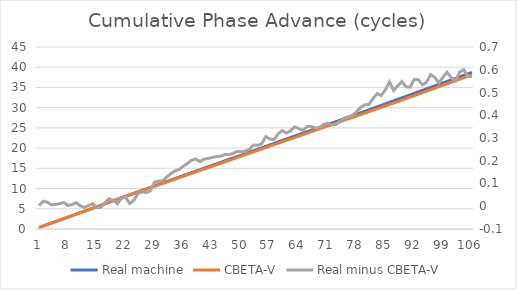
| Category | Real machine | CBETA-V |
|---|---|---|
| 0 | 0.363 | 0.36 |
| 1 | 0.741 | 0.719 |
| 2 | 1.109 | 1.09 |
| 3 | 1.47 | 1.464 |
| 4 | 1.836 | 1.828 |
| 5 | 2.202 | 2.191 |
| 6 | 2.577 | 2.561 |
| 7 | 2.937 | 2.933 |
| 8 | 3.303 | 3.296 |
| 9 | 3.673 | 3.657 |
| 10 | 4.034 | 4.032 |
| 11 | 4.397 | 4.402 |
| 12 | 4.766 | 4.763 |
| 13 | 5.142 | 5.13 |
| 14 | 5.498 | 5.504 |
| 15 | 5.867 | 5.872 |
| 16 | 6.249 | 6.232 |
| 17 | 6.631 | 6.598 |
| 18 | 6.997 | 6.97 |
| 19 | 7.346 | 7.335 |
| 20 | 7.725 | 7.69 |
| 21 | 8.096 | 8.057 |
| 22 | 8.437 | 8.426 |
| 23 | 8.807 | 8.781 |
| 24 | 9.19 | 9.134 |
| 25 | 9.56 | 9.497 |
| 26 | 9.917 | 9.857 |
| 27 | 10.27 | 10.203 |
| 28 | 10.662 | 10.556 |
| 29 | 11.028 | 10.918 |
| 30 | 11.377 | 11.266 |
| 31 | 11.74 | 11.611 |
| 32 | 12.117 | 11.974 |
| 33 | 12.484 | 12.328 |
| 34 | 12.832 | 12.671 |
| 35 | 13.206 | 13.03 |
| 36 | 13.581 | 13.392 |
| 37 | 13.94 | 13.739 |
| 38 | 14.298 | 14.09 |
| 39 | 14.652 | 14.456 |
| 40 | 15.016 | 14.81 |
| 41 | 15.366 | 15.156 |
| 42 | 15.731 | 15.517 |
| 43 | 16.096 | 15.879 |
| 44 | 16.445 | 16.225 |
| 45 | 16.805 | 16.578 |
| 46 | 17.171 | 16.944 |
| 47 | 17.528 | 17.296 |
| 48 | 17.884 | 17.643 |
| 49 | 18.246 | 18.005 |
| 50 | 18.608 | 18.366 |
| 51 | 18.961 | 18.711 |
| 52 | 19.336 | 19.066 |
| 53 | 19.699 | 19.432 |
| 54 | 20.057 | 19.782 |
| 55 | 20.436 | 20.13 |
| 56 | 20.79 | 20.494 |
| 57 | 21.146 | 20.853 |
| 58 | 21.516 | 21.198 |
| 59 | 21.887 | 21.555 |
| 60 | 22.241 | 21.919 |
| 61 | 22.6 | 22.269 |
| 62 | 22.967 | 22.617 |
| 63 | 23.323 | 22.982 |
| 64 | 23.673 | 23.339 |
| 65 | 24.034 | 23.684 |
| 66 | 24.393 | 24.043 |
| 67 | 24.752 | 24.407 |
| 68 | 25.099 | 24.754 |
| 69 | 25.465 | 25.105 |
| 70 | 25.835 | 25.47 |
| 71 | 26.18 | 25.822 |
| 72 | 26.526 | 26.167 |
| 73 | 26.903 | 26.528 |
| 74 | 27.269 | 26.883 |
| 75 | 27.618 | 27.224 |
| 76 | 27.981 | 27.582 |
| 77 | 28.357 | 27.942 |
| 78 | 28.716 | 28.281 |
| 79 | 29.08 | 28.634 |
| 80 | 29.449 | 29.001 |
| 81 | 29.823 | 29.35 |
| 82 | 30.199 | 29.703 |
| 83 | 30.558 | 30.071 |
| 84 | 30.935 | 30.423 |
| 85 | 31.333 | 30.786 |
| 86 | 31.675 | 31.167 |
| 87 | 32.047 | 31.517 |
| 88 | 32.416 | 31.868 |
| 89 | 32.786 | 32.26 |
| 90 | 33.155 | 32.632 |
| 91 | 33.527 | 32.969 |
| 92 | 33.897 | 33.341 |
| 93 | 34.266 | 33.733 |
| 94 | 34.642 | 34.097 |
| 95 | 35.015 | 34.436 |
| 96 | 35.382 | 34.816 |
| 97 | 35.75 | 35.208 |
| 98 | 36.127 | 35.559 |
| 99 | 36.493 | 35.905 |
| 100 | 36.857 | 36.293 |
| 101 | 37.227 | 36.676 |
| 102 | 37.609 | 37.019 |
| 103 | 37.976 | 37.376 |
| 104 | 38.337 | 37.767 |
| 105 | 38.716 | 38.146 |